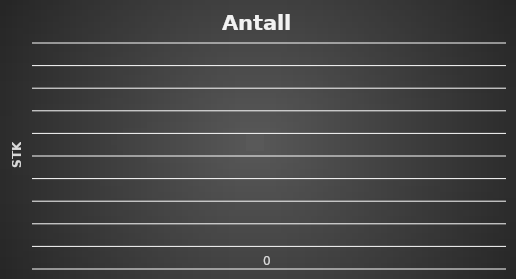
| Category | Antall besvarelser |
|---|---|
| 0 | 0 |